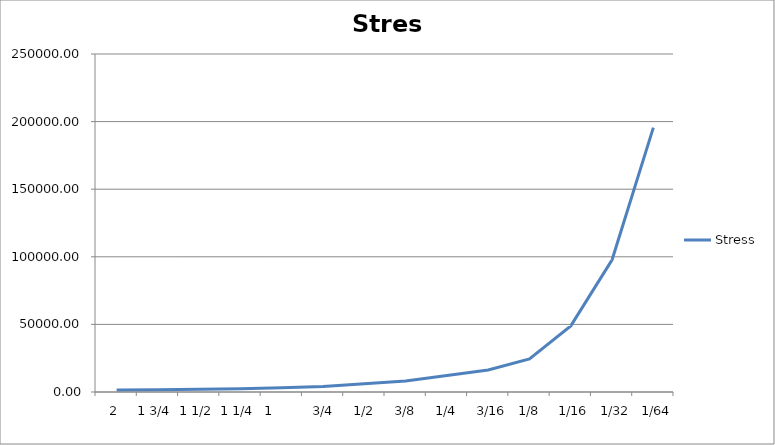
| Category | Stress |
|---|---|
| 2.0 | 1527.887 |
| 1.75 | 1746.157 |
| 1.5 | 2037.183 |
| 1.25 | 2444.62 |
| 1.0 | 3055.775 |
| 0.75 | 4074.367 |
| 0.5 | 6111.55 |
| 0.375 | 8148.733 |
| 0.25 | 12223.1 |
| 0.1875 | 16297.466 |
| 0.125 | 24446.199 |
| 0.0625 | 48892.399 |
| 0.03125 | 97784.797 |
| 0.015625 | 195569.594 |